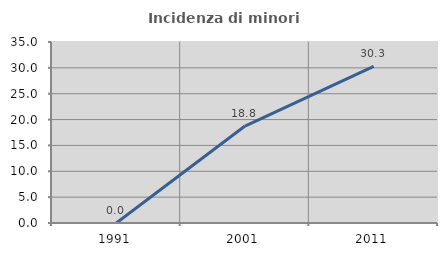
| Category | Incidenza di minori stranieri |
|---|---|
| 1991.0 | 0 |
| 2001.0 | 18.75 |
| 2011.0 | 30.275 |